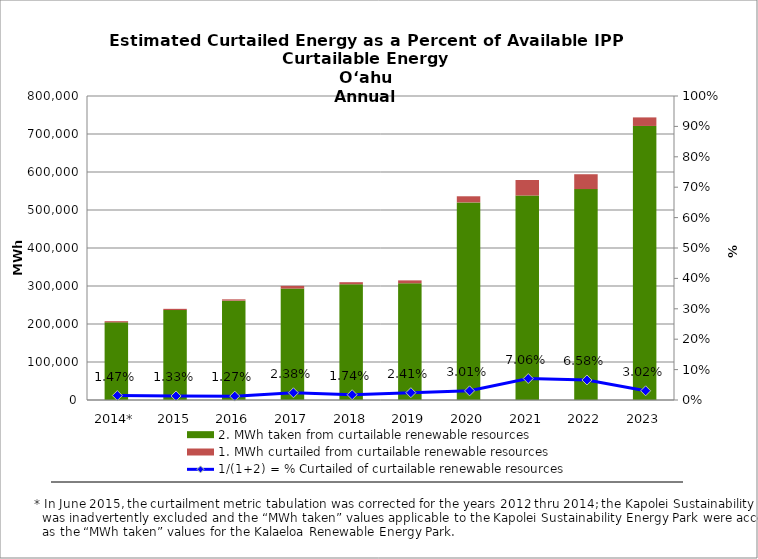
| Category | 2. MWh taken from curtailable renewable resources | 1. MWh curtailed from curtailable renewable resources |
|---|---|---|
| 2014* | 204362 | 3040 |
| 2015 | 236737.642 | 3184.2 |
| 2016 | 261479.737 | 3373.426 |
| 2017 | 293227 | 7156.231 |
| 2018 | 304630 | 5401.052 |
| 2019 | 307205.682 | 7583.363 |
| 2020 | 519956.73 | 16160.384 |
| 2021 | 538115.243 | 40892.741 |
| 2022 | 555015.04 | 39118.568 |
| 2023 | 721176.558 | 22490.521 |